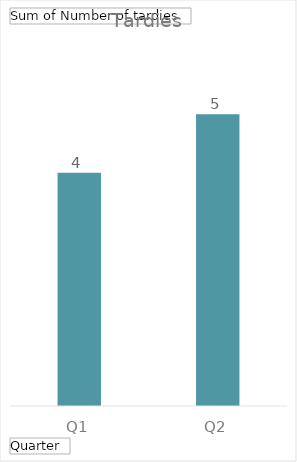
| Category | Total |
|---|---|
| Q1 | 4 |
| Q2 | 5 |